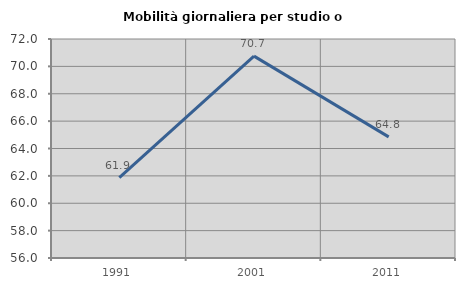
| Category | Mobilità giornaliera per studio o lavoro |
|---|---|
| 1991.0 | 61.875 |
| 2001.0 | 70.748 |
| 2011.0 | 64.848 |